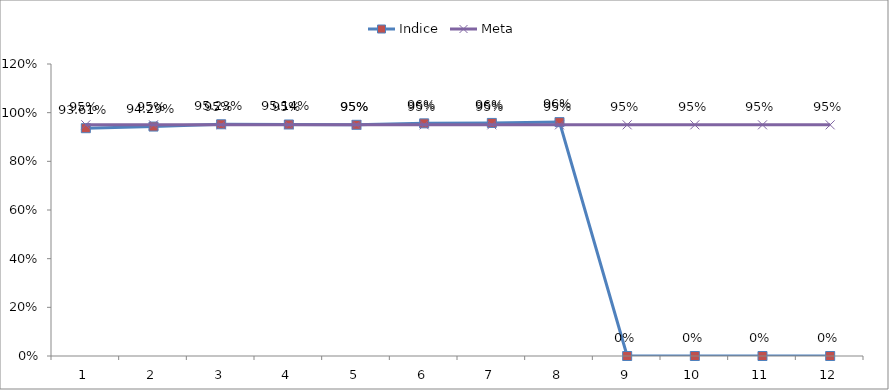
| Category | Indice | Meta |
|---|---|---|
| 0 | 0.936 | 0.95 |
| 1 | 0.943 | 0.95 |
| 2 | 0.952 | 0.95 |
| 3 | 0.951 | 0.95 |
| 4 | 0.95 | 0.95 |
| 5 | 0.956 | 0.95 |
| 6 | 0.958 | 0.95 |
| 7 | 0.961 | 0.95 |
| 8 | 0 | 0.95 |
| 9 | 0 | 0.95 |
| 10 | 0 | 0.95 |
| 11 | 0 | 0.95 |